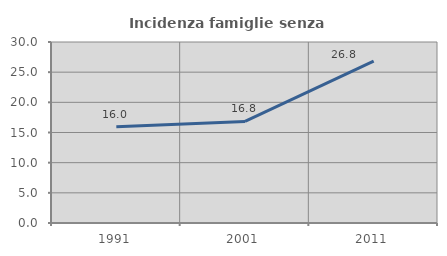
| Category | Incidenza famiglie senza nuclei |
|---|---|
| 1991.0 | 15.965 |
| 2001.0 | 16.834 |
| 2011.0 | 26.843 |